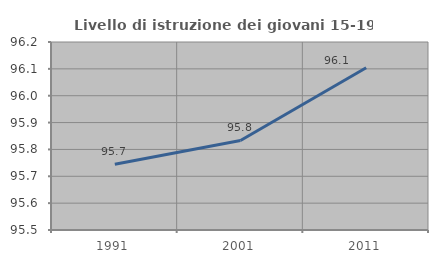
| Category | Livello di istruzione dei giovani 15-19 anni |
|---|---|
| 1991.0 | 95.745 |
| 2001.0 | 95.833 |
| 2011.0 | 96.104 |